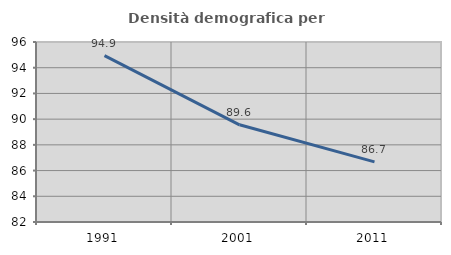
| Category | Densità demografica |
|---|---|
| 1991.0 | 94.942 |
| 2001.0 | 89.559 |
| 2011.0 | 86.677 |